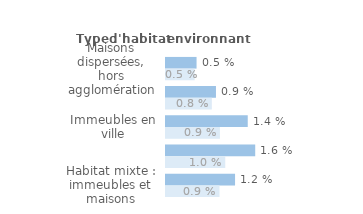
| Category | Series 1 | Series 0 |
|---|---|---|
| Maisons dispersées, hors agglomération | 0.005 | 0.005 |
| Maisons en lotissement, en quartier pavillonnaire | 0.009 | 0.008 |
| Immeubles en ville | 0.014 | 0.009 |
| Immeubles en cité ou grand ensemble | 0.016 | 0.01 |
| Habitat mixte : immeubles et maisons | 0.012 | 0.009 |